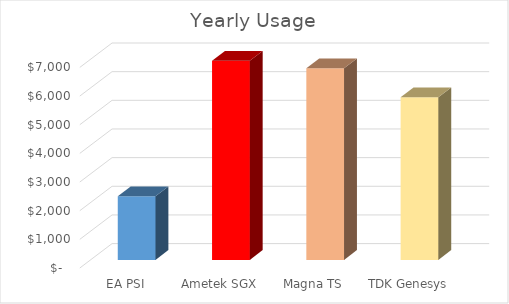
| Category | Series 0 |
|---|---|
| EA PSI | 2221.91 |
| Ametek SGX | 6947.472 |
| Magna TS | 6684.941 |
| TDK Genesys | 5673.235 |